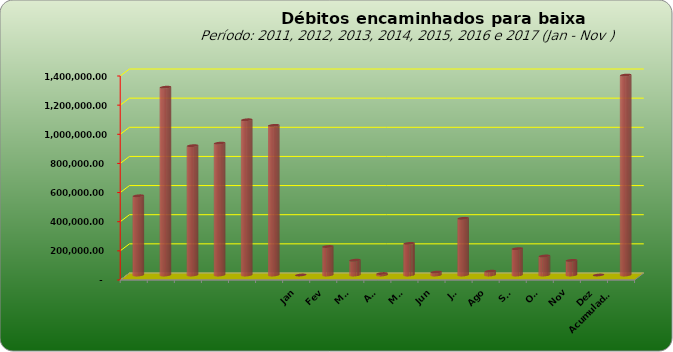
| Category |  543.796,20  |
|---|---|
|  | 543796.2 |
|  | 1289053.69 |
|  | 887573.08 |
|  | 905052.31 |
|  | 1065434.28 |
|  | 1027209.41 |
| Jan | 0 |
| Fev | 195564.55 |
| Mar | 101757.11 |
| Abr | 10195.55 |
| Mai | 217067.29 |
| Jun | 19848.93 |
| Jul | 389298.76 |
| Ago | 26234.02 |
| Set | 180838.97 |
| Out | 130731.84 |
| Nov | 100594.34 |
| Dez | 0 |
| Acumulado
2016 | 1372131.36 |